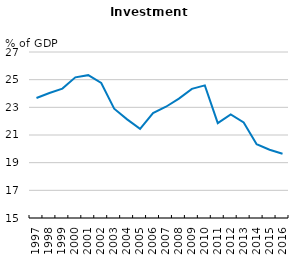
| Category | Tunisia |
|---|---|
| 1997.0 | 23.671 |
| 1998.0 | 24.034 |
| 1999.0 | 24.355 |
| 2000.0 | 25.167 |
| 2001.0 | 25.325 |
| 2002.0 | 24.764 |
| 2003.0 | 22.9 |
| 2004.0 | 22.129 |
| 2005.0 | 21.45 |
| 2006.0 | 22.584 |
| 2007.0 | 23.043 |
| 2008.0 | 23.629 |
| 2009.0 | 24.333 |
| 2010.0 | 24.586 |
| 2011.0 | 21.857 |
| 2012.0 | 22.492 |
| 2013.0 | 21.91 |
| 2014.0 | 20.337 |
| 2015.0 | 19.937 |
| 2016.0 | 19.649 |